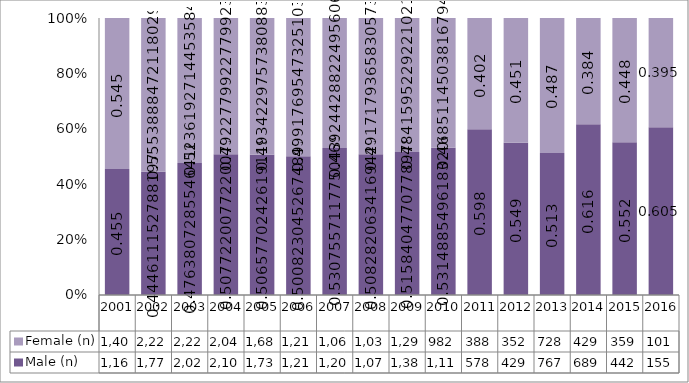
| Category | Male (n) | Female (n) |
|---|---|---|
| 2001.0 | 1168 | 1400 |
| 2002.0 | 1778 | 2221 |
| 2003.0 | 2027 | 2228 |
| 2004.0 | 2104 | 2040 |
| 2005.0 | 1733 | 1688 |
| 2006.0 | 1217 | 1213 |
| 2007.0 | 1208 | 1068 |
| 2008.0 | 1074 | 1039 |
| 2009.0 | 1384 | 1299 |
| 2010.0 | 1114 | 982 |
| 2011.0 | 578 | 388 |
| 2012.0 | 429 | 352 |
| 2013.0 | 767 | 728 |
| 2014.0 | 689 | 429 |
| 2015.0 | 442 | 359 |
| 2016.0 | 155 | 101 |